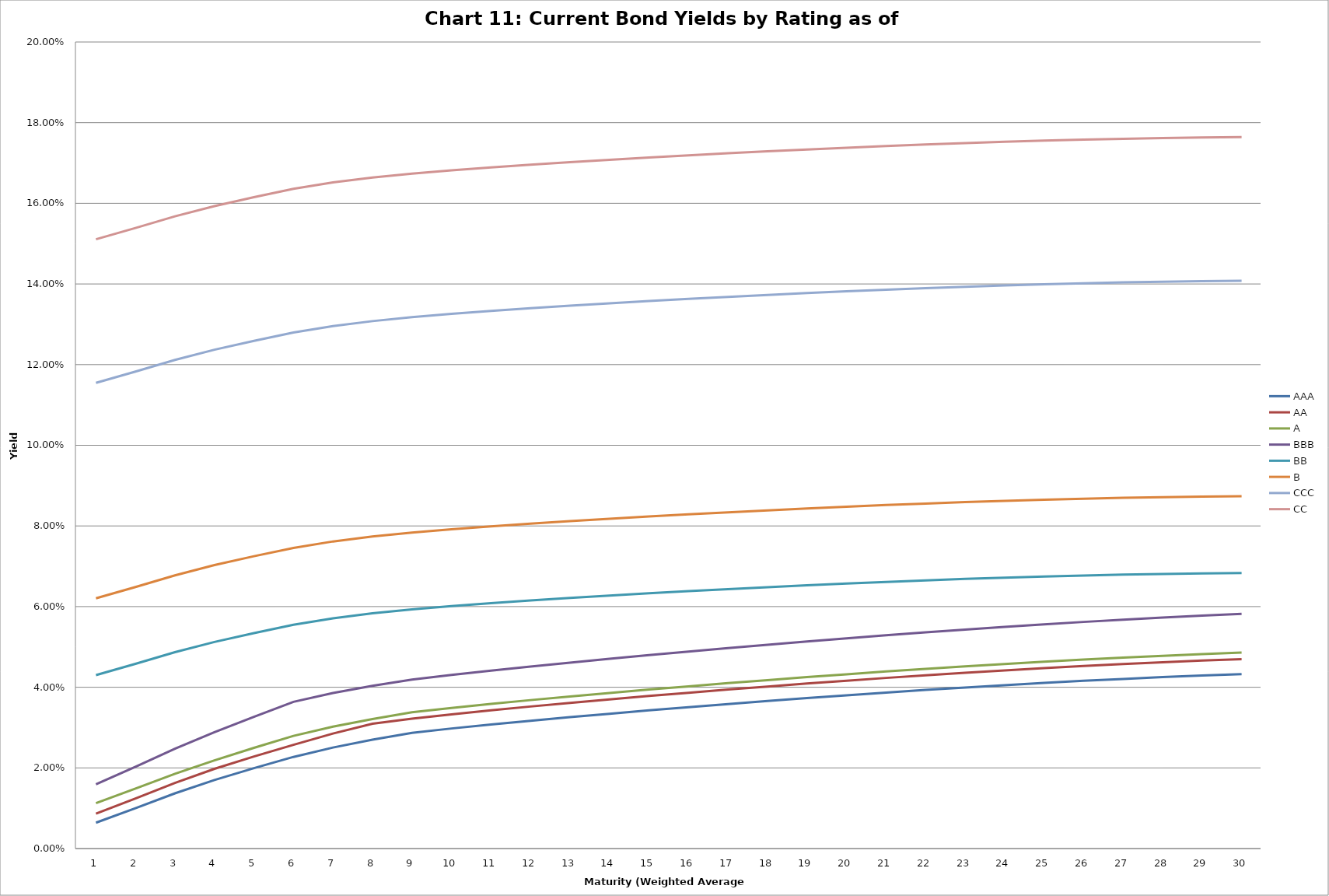
| Category | AAA | AA | A | BBB | BB | B | CCC | CC |
|---|---|---|---|---|---|---|---|---|
| 0 | 0.006 | 0.009 | 0.011 | 0.016 | 0.043 | 0.062 | 0.115 | 0.151 |
| 1 | 0.01 | 0.012 | 0.015 | 0.02 | 0.046 | 0.065 | 0.118 | 0.154 |
| 2 | 0.014 | 0.016 | 0.019 | 0.025 | 0.049 | 0.068 | 0.121 | 0.157 |
| 3 | 0.017 | 0.02 | 0.022 | 0.029 | 0.051 | 0.07 | 0.124 | 0.159 |
| 4 | 0.02 | 0.023 | 0.025 | 0.033 | 0.053 | 0.072 | 0.126 | 0.162 |
| 5 | 0.023 | 0.026 | 0.028 | 0.036 | 0.056 | 0.075 | 0.128 | 0.164 |
| 6 | 0.025 | 0.029 | 0.03 | 0.039 | 0.057 | 0.076 | 0.13 | 0.165 |
| 7 | 0.027 | 0.031 | 0.032 | 0.04 | 0.058 | 0.077 | 0.131 | 0.166 |
| 8 | 0.029 | 0.032 | 0.034 | 0.042 | 0.059 | 0.078 | 0.132 | 0.167 |
| 9 | 0.03 | 0.033 | 0.035 | 0.043 | 0.06 | 0.079 | 0.133 | 0.168 |
| 10 | 0.031 | 0.034 | 0.036 | 0.044 | 0.061 | 0.08 | 0.133 | 0.169 |
| 11 | 0.032 | 0.035 | 0.037 | 0.045 | 0.062 | 0.081 | 0.134 | 0.17 |
| 12 | 0.033 | 0.036 | 0.038 | 0.046 | 0.062 | 0.081 | 0.135 | 0.17 |
| 13 | 0.033 | 0.037 | 0.039 | 0.047 | 0.063 | 0.082 | 0.135 | 0.171 |
| 14 | 0.034 | 0.038 | 0.039 | 0.048 | 0.063 | 0.082 | 0.136 | 0.171 |
| 15 | 0.035 | 0.039 | 0.04 | 0.049 | 0.064 | 0.083 | 0.136 | 0.172 |
| 16 | 0.036 | 0.039 | 0.041 | 0.05 | 0.064 | 0.083 | 0.137 | 0.172 |
| 17 | 0.037 | 0.04 | 0.042 | 0.051 | 0.065 | 0.084 | 0.137 | 0.173 |
| 18 | 0.037 | 0.041 | 0.043 | 0.051 | 0.065 | 0.084 | 0.138 | 0.173 |
| 19 | 0.038 | 0.042 | 0.043 | 0.052 | 0.066 | 0.085 | 0.138 | 0.174 |
| 20 | 0.039 | 0.042 | 0.044 | 0.053 | 0.066 | 0.085 | 0.139 | 0.174 |
| 21 | 0.039 | 0.043 | 0.045 | 0.054 | 0.067 | 0.086 | 0.139 | 0.175 |
| 22 | 0.04 | 0.044 | 0.045 | 0.054 | 0.067 | 0.086 | 0.139 | 0.175 |
| 23 | 0.041 | 0.044 | 0.046 | 0.055 | 0.067 | 0.086 | 0.14 | 0.175 |
| 24 | 0.041 | 0.045 | 0.046 | 0.056 | 0.067 | 0.087 | 0.14 | 0.176 |
| 25 | 0.042 | 0.045 | 0.047 | 0.056 | 0.068 | 0.087 | 0.14 | 0.176 |
| 26 | 0.042 | 0.046 | 0.047 | 0.057 | 0.068 | 0.087 | 0.14 | 0.176 |
| 27 | 0.043 | 0.046 | 0.048 | 0.057 | 0.068 | 0.087 | 0.141 | 0.176 |
| 28 | 0.043 | 0.047 | 0.048 | 0.058 | 0.068 | 0.087 | 0.141 | 0.176 |
| 29 | 0.043 | 0.047 | 0.049 | 0.058 | 0.068 | 0.087 | 0.141 | 0.176 |